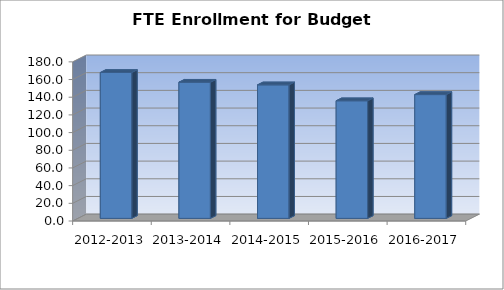
| Category | FTE Enrollment for Budget Authority |
|---|---|
| 2012-2013 | 165 |
| 2013-2014 | 154 |
| 2014-2015 | 151 |
| 2015-2016 | 133 |
| 2016-2017 | 140 |